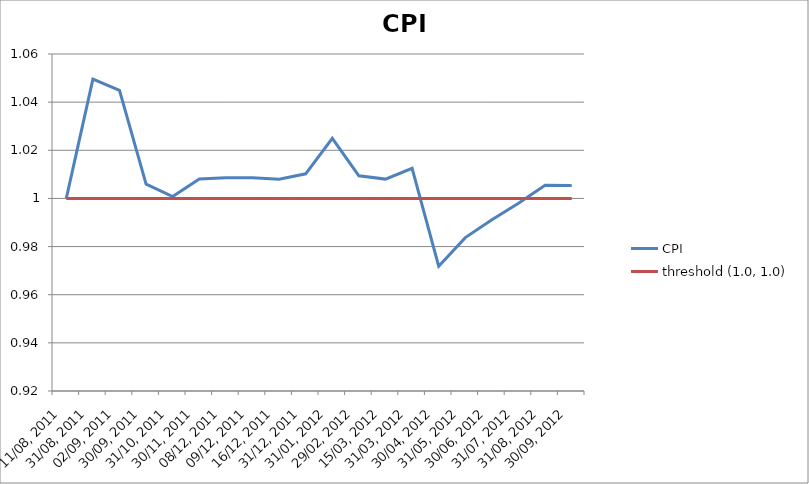
| Category | CPI | threshold (1.0, 1.0) |
|---|---|---|
| 11/08, 2011 | 1 | 1 |
| 31/08, 2011 | 1.05 | 1 |
| 02/09, 2011 | 1.045 | 1 |
| 30/09, 2011 | 1.006 | 1 |
| 31/10, 2011 | 1.001 | 1 |
| 30/11, 2011 | 1.008 | 1 |
| 08/12, 2011 | 1.009 | 1 |
| 09/12, 2011 | 1.009 | 1 |
| 16/12, 2011 | 1.008 | 1 |
| 31/12, 2011 | 1.01 | 1 |
| 31/01, 2012 | 1.025 | 1 |
| 29/02, 2012 | 1.009 | 1 |
| 15/03, 2012 | 1.008 | 1 |
| 31/03, 2012 | 1.013 | 1 |
| 30/04, 2012 | 0.972 | 1 |
| 31/05, 2012 | 0.984 | 1 |
| 30/06, 2012 | 0.991 | 1 |
| 31/07, 2012 | 0.998 | 1 |
| 31/08, 2012 | 1.005 | 1 |
| 30/09, 2012 | 1.005 | 1 |